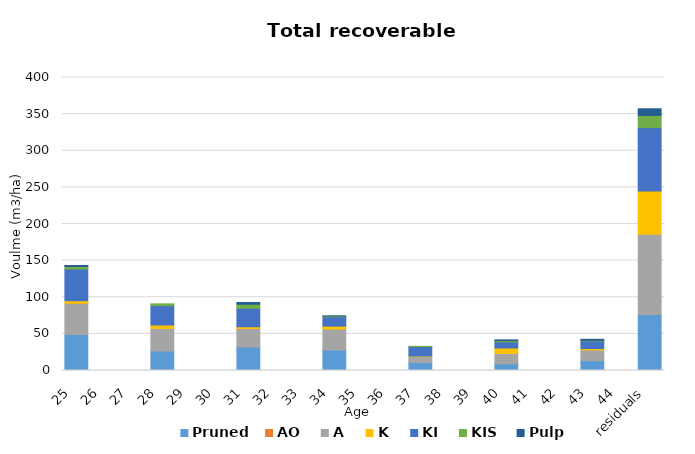
| Category | Pruned | AO | A | K | KI | KIS | Pulp |
|---|---|---|---|---|---|---|---|
|  25  | 49.091 | 0 | 42.671 | 3.551 | 43.188 | 3.473 | 1.367 |
|  26  | 0 | 0 | 0 | 0 | 0 | 0 | 0 |
|  27  | 0 | 0 | 0 | 0 | 0 | 0 | 0 |
|  28  | 26.59 | 0 | 30.763 | 4.794 | 26.421 | 2.403 | 0 |
|  29  | 0 | 0 | 0 | 0 | 0 | 0 | 0 |
|  30  | 0 | 0 | 0 | 0 | 0 | 0 | 0 |
|  31  | 32.138 | 0 | 25.08 | 2.481 | 25.286 | 5.47 | 2.395 |
|  32  | 0 | 0 | 0 | 0 | 0 | 0 | 0 |
|  33  | 0 | 0 | 0 | 0 | 0 | 0 | 0 |
|  34  | 28.005 | 0 | 28.511 | 4.083 | 12.555 | 1.128 | 0.197 |
|  35  | 0 | 0 | 0 | 0 | 0 | 0 | 0 |
|  36  | 0 | 0 | 0 | 0 | 0 | 0 | 0 |
|  37  | 10.952 | 0 | 8.251 | 0.595 | 12.801 | 0.402 | 0 |
|  38  | 0 | 0 | 0 | 0 | 0 | 0 | 0 |
|  39  | 0 | 0 | 0 | 0 | 0 | 0 | 0 |
|  40  | 9.067 | 0 | 14.14 | 7.566 | 8.278 | 1.783 | 0.936 |
|  41  | 0 | 0 | 0 | 0 | 0 | 0 | 0 |
|  42  | 0 | 0 | 0 | 0 | 0 | 0 | 0 |
|  43  | 13.31 | 0 | 14.621 | 2.024 | 10.451 | 0.868 | 1.311 |
|  44  | 0 | 0 | 0 | 0 | 0 | 0 | 0 |
| residuals | 76.556 | 0 | 109.471 | 59.116 | 86.483 | 16.586 | 9.082 |